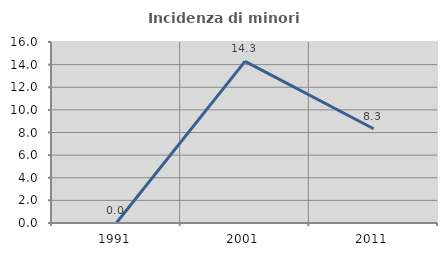
| Category | Incidenza di minori stranieri |
|---|---|
| 1991.0 | 0 |
| 2001.0 | 14.286 |
| 2011.0 | 8.333 |